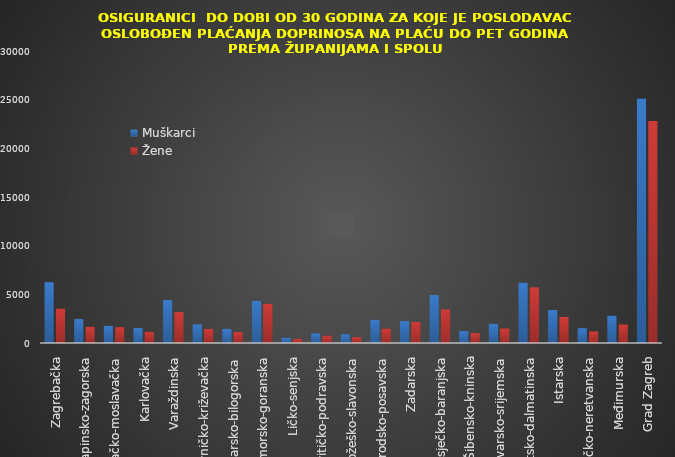
| Category | Muškarci | Žene |
|---|---|---|
| Zagrebačka | 6245 | 3535 |
| Krapinsko-zagorska | 2475 | 1675 |
| Sisačko-moslavačka | 1757 | 1631 |
| Karlovačka | 1543 | 1160 |
| Varaždinska | 4411 | 3171 |
| Koprivničko-križevačka | 1916 | 1448 |
| Bjelovarsko-bilogorska | 1453 | 1120 |
| Primorsko-goranska | 4342 | 4021 |
| Ličko-senjska | 546 | 424 |
| Virovitičko-podravska | 981 | 752 |
| Požeško-slavonska | 887 | 601 |
| Brodsko-posavska | 2388 | 1481 |
| Zadarska | 2251 | 2159 |
| Osječko-baranjska | 4925 | 3452 |
| Šibensko-kninska | 1218 | 1018 |
| Vukovarsko-srijemska | 1965 | 1490 |
| Splitsko-dalmatinska | 6205 | 5720 |
| Istarska | 3393 | 2674 |
| Dubrovačko-neretvanska | 1524 | 1186 |
| Međimurska | 2807 | 1902 |
| Grad Zagreb | 25114 | 22800 |